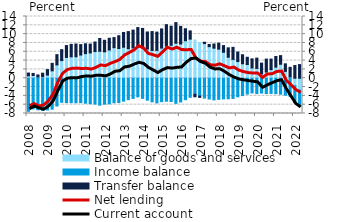
| Category | Balance of goods and services | Income balance | Transfer balance |
|---|---|---|---|
| 2008.0 | 0.541 | -7.511 | 0.629 |
| 2008.0 | 0.609 | -6.943 | 0.476 |
| 2008.0 | 0.273 | -7.169 | 0.473 |
| 2008.0 | 0.346 | -7.328 | 0.793 |
| 2009.0 | 0.706 | -7.197 | 1.252 |
| 2009.0 | 1.675 | -7.025 | 1.701 |
| 2009.0 | 3.027 | -6.308 | 2.318 |
| 2009.0 | 4.007 | -5.459 | 2.474 |
| 2010.0 | 4.716 | -5.54 | 2.695 |
| 2010.0 | 4.854 | -5.546 | 2.821 |
| 2010.0 | 4.873 | -5.567 | 2.88 |
| 2010.0 | 5.257 | -5.543 | 2.369 |
| 2011.0 | 5.582 | -5.663 | 2.228 |
| 2011.0 | 5.735 | -5.785 | 2.009 |
| 2011.0 | 6.048 | -5.867 | 2.164 |
| 2011.0 | 6.111 | -6.106 | 2.904 |
| 2012.0 | 5.988 | -5.882 | 2.62 |
| 2012.0 | 6.402 | -5.807 | 2.663 |
| 2012.0 | 6.93 | -5.56 | 2.29 |
| 2012.0 | 6.747 | -5.513 | 2.894 |
| 2013.0 | 7.03 | -5.199 | 3.351 |
| 2013.0 | 6.699 | -4.853 | 3.877 |
| 2013.0 | 6.879 | -4.588 | 4.032 |
| 2013.0 | 6.969 | -4.228 | 4.52 |
| 2014.0 | 7.033 | -4.564 | 4.258 |
| 2014.0 | 6.621 | -4.975 | 3.87 |
| 2014.0 | 6.305 | -5.362 | 4.274 |
| 2014.0 | 6.314 | -5.597 | 4.144 |
| 2015.0 | 6.836 | -5.307 | 4.349 |
| 2015.0 | 7.306 | -5.215 | 4.841 |
| 2015.0 | 7.474 | -5.282 | 4.318 |
| 2015.0 | 7.941 | -5.692 | 4.671 |
| 2016.0 | 7.762 | -5.376 | 4.001 |
| 2016.0 | 8.501 | -4.869 | 2.722 |
| 2016.0 | 8.866 | -4.328 | 1.866 |
| 2016.0 | 8.671 | -3.64 | -0.569 |
| 2017.0 | 8.088 | -4.053 | -0.284 |
| 2017.0 | 7.86 | -4.507 | 0.303 |
| 2017.0 | 7.161 | -4.724 | 0.502 |
| 2017.0 | 6.819 | -4.916 | 0.941 |
| 2018.0 | 6.594 | -4.793 | 1.357 |
| 2018.0 | 5.893 | -4.688 | 1.506 |
| 2018.0 | 4.758 | -4.662 | 2.138 |
| 2018.0 | 4.266 | -4.588 | 2.733 |
| 2019.0 | 3.781 | -4.211 | 2.159 |
| 2019.0 | 3.279 | -3.938 | 2.046 |
| 2019.0 | 3.11 | -3.589 | 1.641 |
| 2019.0 | 2.331 | -3.334 | 2.066 |
| 2020.0 | 2.221 | -3.488 | 2.343 |
| 2020.0 | 0.98 | -3.361 | 2.445 |
| 2020.0 | 1.411 | -3.481 | 2.922 |
| 2020.0 | 1.944 | -3.447 | 2.4 |
| 2021.0 | 2.51 | -3.505 | 2.417 |
| 2021.0 | 3.166 | -3.625 | 1.963 |
| 2021.0 | 1.549 | -3.844 | 1.715 |
| 2021.0 | 0.304 | -4.098 | 2.171 |
| 2022.0 | -1.699 | -3.858 | 2.878 |
| 2022.0 | -2.679 | -3.737 | 3.089 |